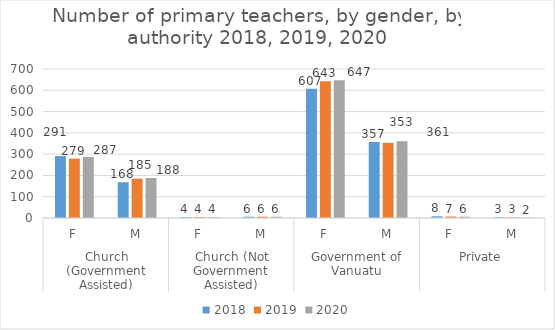
| Category | 2018 | 2019 | 2020 |
|---|---|---|---|
| 0 | 291 | 279 | 287 |
| 1 | 168 | 185 | 188 |
| 2 | 4 | 4 | 4 |
| 3 | 6 | 6 | 6 |
| 4 | 607 | 643 | 647 |
| 5 | 357 | 353 | 361 |
| 6 | 8 | 7 | 6 |
| 7 | 3 | 3 | 2 |